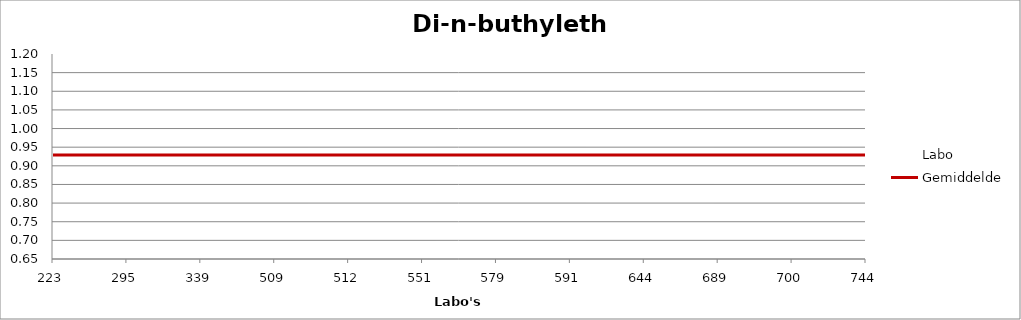
| Category | Labo | Gemiddelde |
|---|---|---|
| 223.0 | 1.073 | 0.929 |
| 295.0 | 1.036 | 0.929 |
| 339.0 | 0.733 | 0.929 |
| 509.0 | 0.965 | 0.929 |
| 512.0 | 0 | 0.929 |
| 551.0 | 0.714 | 0.929 |
| 579.0 | 0.985 | 0.929 |
| 591.0 | 0.964 | 0.929 |
| 644.0 | 0 | 0.929 |
| 689.0 | 0.905 | 0.929 |
| 700.0 | 1.085 | 0.929 |
| 744.0 | 0.835 | 0.929 |